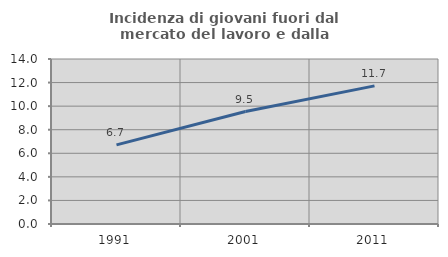
| Category | Incidenza di giovani fuori dal mercato del lavoro e dalla formazione  |
|---|---|
| 1991.0 | 6.713 |
| 2001.0 | 9.543 |
| 2011.0 | 11.721 |